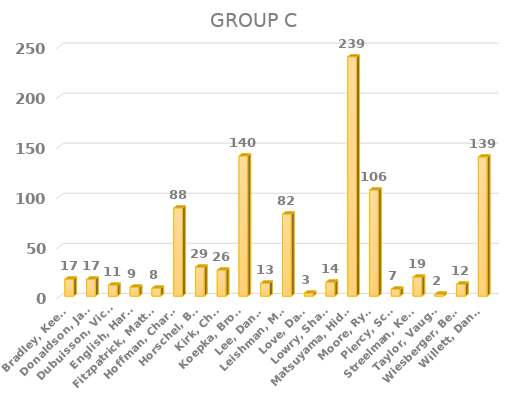
| Category | Series 0 |
|---|---|
| Bradley, Keegan | 17 |
| Donaldson, Jamie | 17 |
| Dubuisson, Victor | 11 |
| English, Harris | 9 |
| Fitzpatrick, Matthew | 8 |
| Hoffman, Charley | 88 |
| Horschel, Billy | 29 |
| Kirk, Chris | 26 |
| Koepka, Brooks | 140 |
| Lee, Danny | 13 |
| Leishman, Marc | 82 |
| Love, Davis | 3 |
| Lowry, Shane | 14 |
| Matsuyama, Hideki | 239 |
| Moore, Ryan | 106 |
| Piercy, Scott | 7 |
| Streelman, Kevin | 19 |
| Taylor, Vaughn | 2 |
| Wiesberger, Bernd | 12 |
| Willett, Danny | 139 |